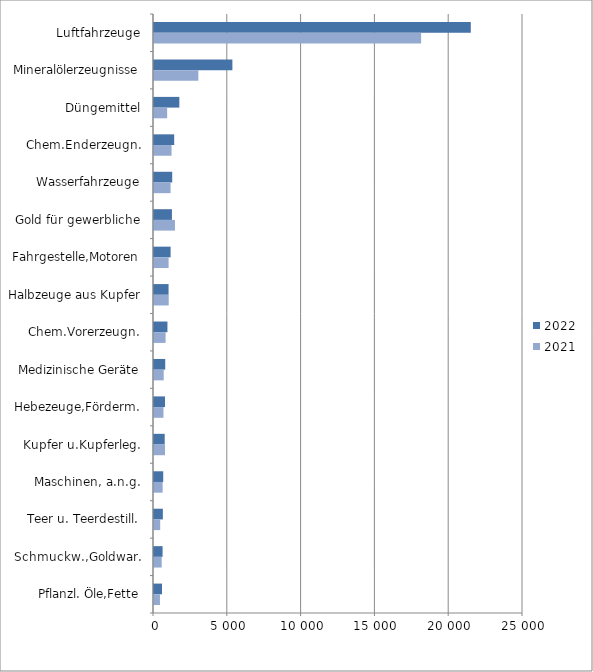
| Category | 2022 | 2021 |
|---|---|---|
| Luftfahrzeuge | 21462.371 | 18096.859 |
| Mineralölerzeugnisse | 5310.28 | 3005.155 |
| Düngemittel | 1716.993 | 891.143 |
| Chem.Enderzeugn. | 1368.882 | 1188.164 |
| Wasserfahrzeuge | 1233.845 | 1122.183 |
| Gold für gewerbliche | 1214.9 | 1420.022 |
| Fahrgestelle,Motoren | 1125.251 | 989.973 |
| Halbzeuge aus Kupfer | 986.663 | 995.828 |
| Chem.Vorerzeugn. | 910.682 | 786.159 |
| Medizinische Geräte | 760.811 | 656.827 |
| Hebezeuge,Förderm. | 745.902 | 641.255 |
| Kupfer u.Kupferleg. | 725.067 | 746.747 |
| Maschinen, a.n.g. | 625.105 | 586.829 |
| Teer u. Teerdestill. | 599.94 | 419.786 |
| Schmuckw.,Goldwar. | 581.891 | 520.836 |
| Pflanzl. Öle,Fette | 540.939 | 403.744 |